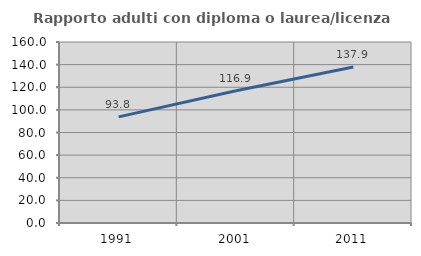
| Category | Rapporto adulti con diploma o laurea/licenza media  |
|---|---|
| 1991.0 | 93.814 |
| 2001.0 | 116.912 |
| 2011.0 | 137.931 |